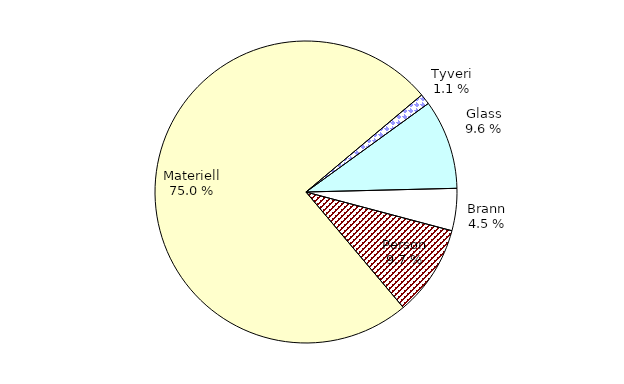
| Category | Series 0 |
|---|---|
| Tyveri | 50.709 |
| Glass | 426.678 |
| Brann | 201.369 |
| Person | 433.236 |
| Materiell | 3341.043 |